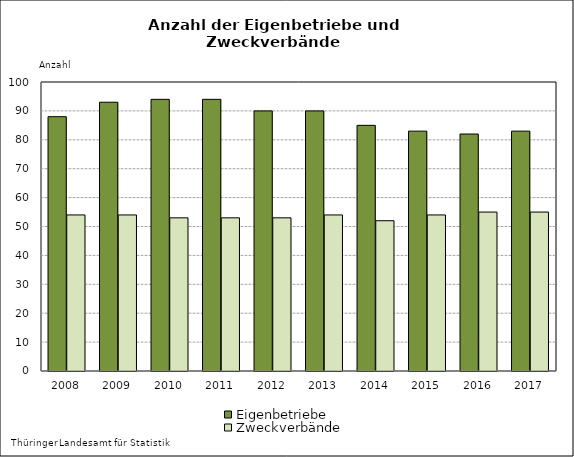
| Category | Eigenbetriebe | Zweckverbände |
|---|---|---|
| 2008.0 | 88 | 54 |
| 2009.0 | 93 | 54 |
| 2010.0 | 94 | 53 |
| 2011.0 | 94 | 53 |
| 2012.0 | 90 | 53 |
| 2013.0 | 90 | 54 |
| 2014.0 | 85 | 52 |
| 2015.0 | 83 | 54 |
| 2016.0 | 82 | 55 |
| 2017.0 | 83 | 55 |